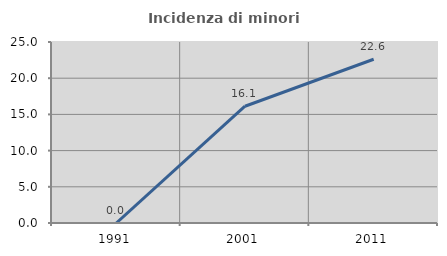
| Category | Incidenza di minori stranieri |
|---|---|
| 1991.0 | 0 |
| 2001.0 | 16.129 |
| 2011.0 | 22.619 |